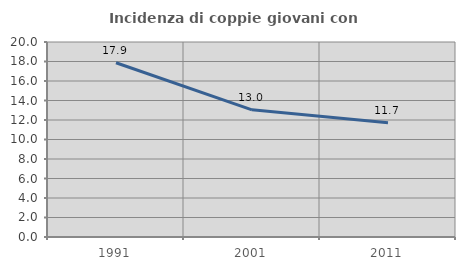
| Category | Incidenza di coppie giovani con figli |
|---|---|
| 1991.0 | 17.876 |
| 2001.0 | 13.043 |
| 2011.0 | 11.726 |